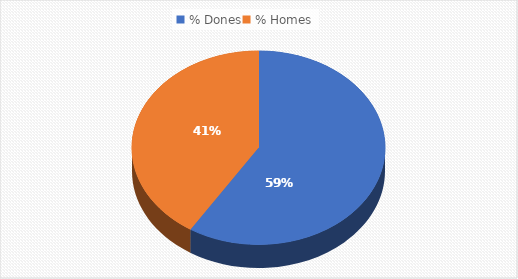
| Category | Series 0 |
|---|---|
| % Dones | 0.59 |
| % Homes | 0.41 |